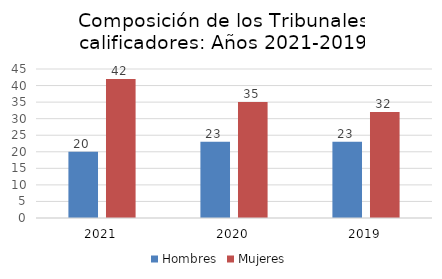
| Category | Hombres | Mujeres |
|---|---|---|
| 0 | 20 | 42 |
| 1 | 23 | 35 |
| 2 | 23 | 32 |